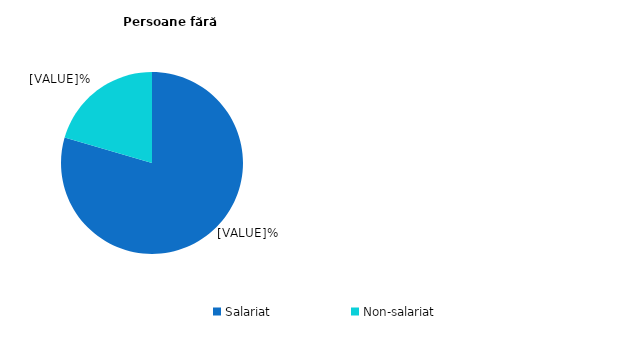
| Category | Persoane     fără    dizabilități |
|---|---|
| Salariat | 79.5 |
| Non-salariat | 20.5 |